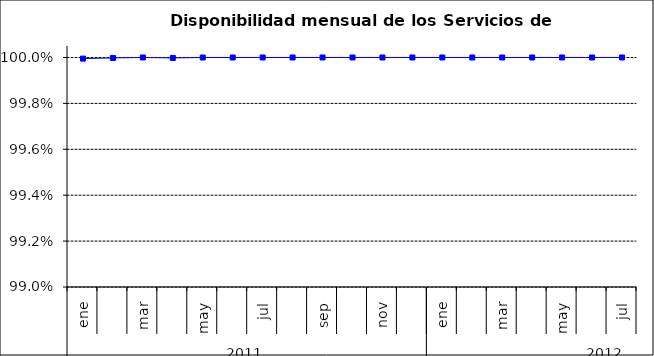
| Category | SCL |
|---|---|
| 0 | 1 |
| 1 | 1 |
| 2 | 1 |
| 3 | 1 |
| 4 | 1 |
| 5 | 1 |
| 6 | 1 |
| 7 | 1 |
| 8 | 1 |
| 9 | 1 |
| 10 | 1 |
| 11 | 1 |
| 12 | 1 |
| 13 | 1 |
| 14 | 1 |
| 15 | 1 |
| 16 | 1 |
| 17 | 1 |
| 18 | 1 |